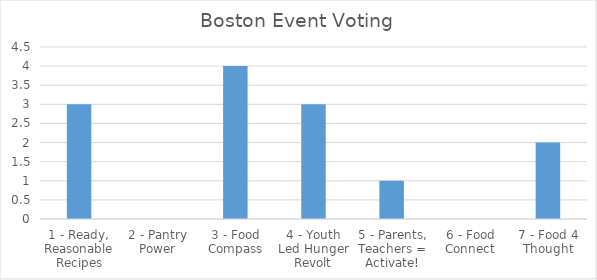
| Category | Boston Event Voting |
|---|---|
| 1 - Ready, Reasonable Recipes | 3 |
| 2 - Pantry Power | 0 |
| 3 - Food Compass | 4 |
| 4 - Youth Led Hunger Revolt | 3 |
| 5 - Parents, Teachers = Activate! | 1 |
| 6 - Food Connect | 0 |
| 7 - Food 4 Thought | 2 |